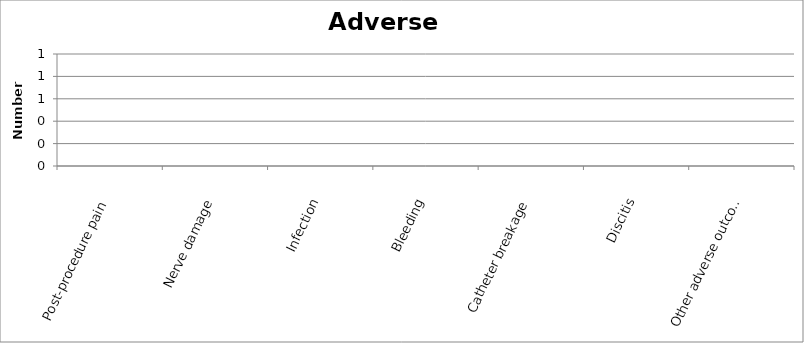
| Category | Series 0 |
|---|---|
| Post-procedure pain | 0 |
| Nerve damage | 0 |
| Infection | 0 |
| Bleeding | 0 |
| Catheter breakage | 0 |
| Discitis | 0 |
| Other adverse outcome | 0 |